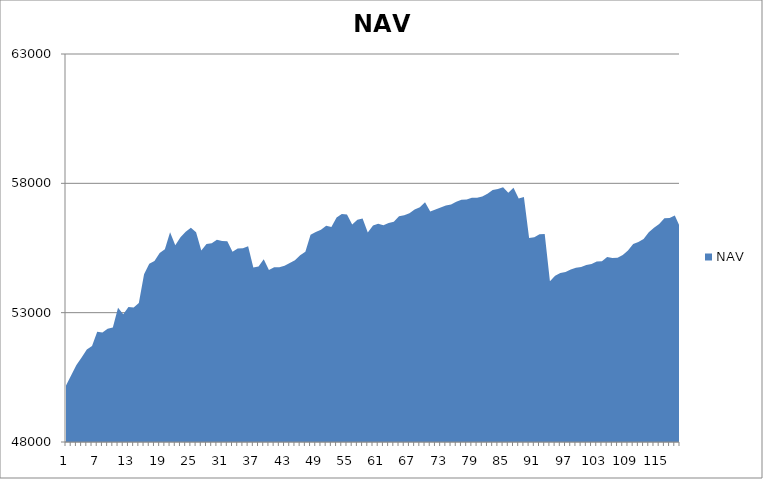
| Category | NAV |
|---|---|
| 0 | 50185.185 |
| 1 | 50585.185 |
| 2 | 50973.977 |
| 3 | 51265.977 |
| 4 | 51576.741 |
| 5 | 51711.523 |
| 6 | 52262.893 |
| 7 | 52230.24 |
| 8 | 52381.556 |
| 9 | 52425.915 |
| 10 | 53192.581 |
| 11 | 52939.146 |
| 12 | 53220.069 |
| 13 | 53197.341 |
| 14 | 53369.61 |
| 15 | 54480.721 |
| 16 | 54888.365 |
| 17 | 55001.902 |
| 18 | 55308.308 |
| 19 | 55448.308 |
| 20 | 56110.305 |
| 21 | 55610.305 |
| 22 | 55916.954 |
| 23 | 56129.798 |
| 24 | 56279.798 |
| 25 | 56105.301 |
| 26 | 55401.645 |
| 27 | 55657.201 |
| 28 | 55686.925 |
| 29 | 55823.001 |
| 30 | 55769.596 |
| 31 | 55759.375 |
| 32 | 55350.284 |
| 33 | 55480.284 |
| 34 | 55492.498 |
| 35 | 55570.42 |
| 36 | 54746.89 |
| 37 | 54783.7 |
| 38 | 55066.459 |
| 39 | 54651.074 |
| 40 | 54754.078 |
| 41 | 54760.213 |
| 42 | 54816.924 |
| 43 | 54917.296 |
| 44 | 55025.73 |
| 45 | 55220.535 |
| 46 | 55353.465 |
| 47 | 56009.309 |
| 48 | 56118.959 |
| 49 | 56205.212 |
| 50 | 56362.876 |
| 51 | 56307.394 |
| 52 | 56678.935 |
| 53 | 56813.264 |
| 54 | 56799.502 |
| 55 | 56409.112 |
| 56 | 56596.44 |
| 57 | 56640.493 |
| 58 | 56102.227 |
| 59 | 56370.449 |
| 60 | 56434.248 |
| 61 | 56376.841 |
| 62 | 56464.524 |
| 63 | 56518.022 |
| 64 | 56724.747 |
| 65 | 56770.361 |
| 66 | 56848.099 |
| 67 | 56992.896 |
| 68 | 57073.571 |
| 69 | 57266.481 |
| 70 | 56908.016 |
| 71 | 56984.939 |
| 72 | 57069.276 |
| 73 | 57147.627 |
| 74 | 57179.83 |
| 75 | 57291.17 |
| 76 | 57366.35 |
| 77 | 57371.599 |
| 78 | 57439.215 |
| 79 | 57440.895 |
| 80 | 57490.895 |
| 81 | 57593.679 |
| 82 | 57746.643 |
| 83 | 57785.413 |
| 84 | 57849.748 |
| 85 | 57639.346 |
| 86 | 57828.82 |
| 87 | 57417.055 |
| 88 | 57471.335 |
| 89 | 55888.376 |
| 90 | 55913.907 |
| 91 | 56031.989 |
| 92 | 56044.711 |
| 93 | 54210.631 |
| 94 | 54422.612 |
| 95 | 54536.647 |
| 96 | 54575.903 |
| 97 | 54670.229 |
| 98 | 54737.367 |
| 99 | 54762.386 |
| 100 | 54842.923 |
| 101 | 54881.385 |
| 102 | 54978.816 |
| 103 | 54991.283 |
| 104 | 55149.699 |
| 105 | 55109.498 |
| 106 | 55121.656 |
| 107 | 55227.569 |
| 108 | 55405.15 |
| 109 | 55650.183 |
| 110 | 55733.424 |
| 111 | 55846.244 |
| 112 | 56110.95 |
| 113 | 56283.172 |
| 114 | 56430.541 |
| 115 | 56648.489 |
| 116 | 56663.919 |
| 117 | 56752.272 |
| 118 | 56318.108 |